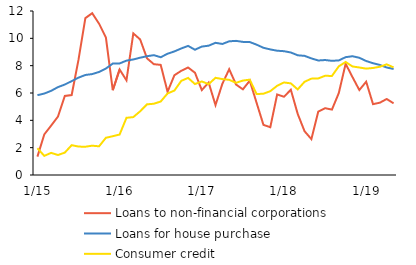
| Category | Loans to non-financial corporations | Loans for house purchase | Consumer credit |
|---|---|---|---|
|  1/15 | 1.344 | 5.84 | 1.96 |
| 2 | 2.969 | 5.96 | 1.4 |
| 3 | 3.615 | 6.159 | 1.62 |
| 4 | 4.281 | 6.43 | 1.462 |
| 5 | 5.782 | 6.62 | 1.639 |
| 6 | 5.853 | 6.869 | 2.183 |
| 7 | 8.437 | 7.124 | 2.08 |
| 8 | 11.475 | 7.318 | 2.069 |
| 9 | 11.846 | 7.384 | 2.145 |
| 10 | 11.075 | 7.54 | 2.098 |
| 11 | 10.058 | 7.79 | 2.724 |
| 12 | 6.204 | 8.153 | 2.838 |
|  1/16 | 7.719 | 8.163 | 2.96 |
| 2 | 6.928 | 8.368 | 4.184 |
| 3 | 10.362 | 8.454 | 4.237 |
| 4 | 9.918 | 8.583 | 4.663 |
| 5 | 8.537 | 8.692 | 5.171 |
| 6 | 8.109 | 8.768 | 5.214 |
| 7 | 8.057 | 8.617 | 5.377 |
| 8 | 6.09 | 8.871 | 5.965 |
| 9 | 7.299 | 9.044 | 6.179 |
| 10 | 7.625 | 9.26 | 6.887 |
| 11 | 7.866 | 9.446 | 7.103 |
| 12 | 7.485 | 9.166 | 6.655 |
|  1/17 | 6.213 | 9.397 | 6.847 |
| 2 | 6.765 | 9.463 | 6.648 |
| 3 | 5.115 | 9.671 | 7.111 |
| 4 | 6.673 | 9.588 | 7.018 |
| 5 | 7.74 | 9.782 | 6.965 |
| 6 | 6.618 | 9.815 | 6.745 |
| 7 | 6.269 | 9.74 | 6.909 |
| 8 | 6.902 | 9.729 | 6.978 |
| 9 | 5.281 | 9.537 | 5.921 |
| 10 | 3.669 | 9.308 | 5.949 |
| 11 | 3.496 | 9.188 | 6.133 |
| 12 | 5.891 | 9.094 | 6.528 |
|  1/18 | 5.728 | 9.059 | 6.772 |
| 2 | 6.234 | 8.964 | 6.704 |
| 3 | 4.475 | 8.76 | 6.263 |
| 4 | 3.204 | 8.718 | 6.82 |
| 5 | 2.625 | 8.532 | 7.051 |
| 6 | 4.638 | 8.379 | 7.065 |
| 7 | 4.89 | 8.413 | 7.26 |
| 8 | 4.785 | 8.355 | 7.247 |
| 9 | 5.993 | 8.384 | 7.95 |
| 10 | 8.137 | 8.622 | 8.271 |
| 11 | 7.165 | 8.691 | 7.942 |
| 12 | 6.217 | 8.577 | 7.867 |
|  1/19 | 6.825 | 8.34 | 7.783 |
| 2 | 5.184 | 8.179 | 7.832 |
| 3 | 5.293 | 8.052 | 7.921 |
| 4 | 5.561 | 7.865 | 8.096 |
| 5 | 5.245 | 7.758 | 7.872 |